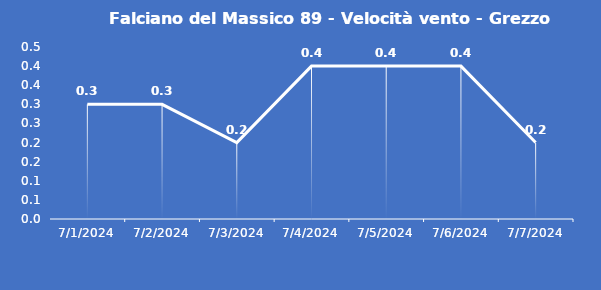
| Category | Falciano del Massico 89 - Velocità vento - Grezzo (m/s) |
|---|---|
| 7/1/24 | 0.3 |
| 7/2/24 | 0.3 |
| 7/3/24 | 0.2 |
| 7/4/24 | 0.4 |
| 7/5/24 | 0.4 |
| 7/6/24 | 0.4 |
| 7/7/24 | 0.2 |